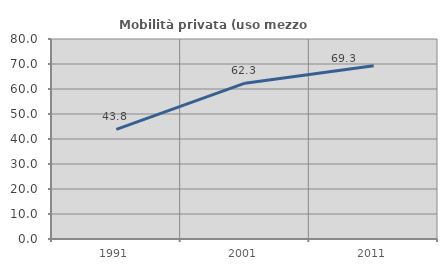
| Category | Mobilità privata (uso mezzo privato) |
|---|---|
| 1991.0 | 43.836 |
| 2001.0 | 62.329 |
| 2011.0 | 69.325 |